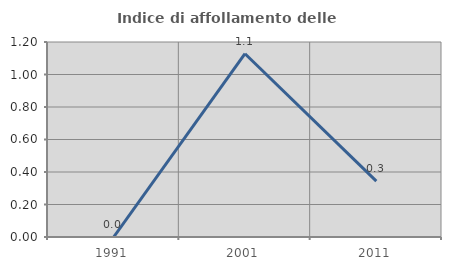
| Category | Indice di affollamento delle abitazioni  |
|---|---|
| 1991.0 | 0 |
| 2001.0 | 1.128 |
| 2011.0 | 0.344 |